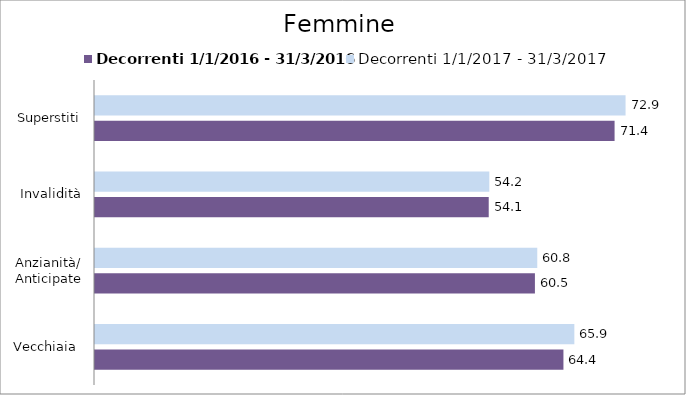
| Category | Decorrenti 1/1/2016 - 31/3/2016 | Decorrenti 1/1/2017 - 31/3/2017 |
|---|---|---|
| Vecchiaia  | 64.39 | 65.89 |
| Anzianità/ Anticipate | 60.47 | 60.79 |
| Invalidità | 54.12 | 54.2 |
| Superstiti | 71.42 | 72.93 |